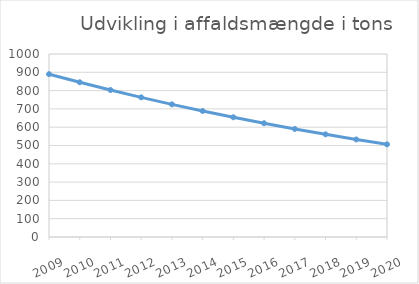
| Category | Series 0 |
|---|---|
| 2009.0 | 890 |
| 2010.0 | 845.5 |
| 2011.0 | 803.225 |
| 2012.0 | 763.064 |
| 2013.0 | 724.911 |
| 2014.0 | 688.665 |
| 2015.0 | 654.232 |
| 2016.0 | 621.52 |
| 2017.0 | 590.444 |
| 2018.0 | 560.922 |
| 2019.0 | 532.876 |
| 2020.0 | 506.232 |